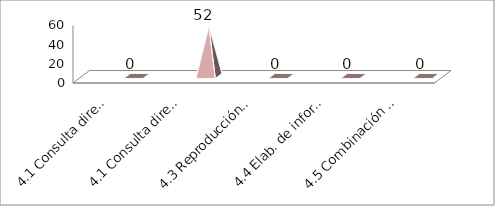
| Category | Series 0 | Series 1 | Series 2 |
|---|---|---|---|
| 4.1 Consulta directa personal |  |  | 0 |
| 4.1 Consulta directa personal |  |  | 52 |
| 4.3 Reproducción de docs. |  |  | 0 |
| 4.4 Elab. de informe. Específ. |  |  | 0 |
| 4.5 Combinación de las anter. |  |  | 0 |